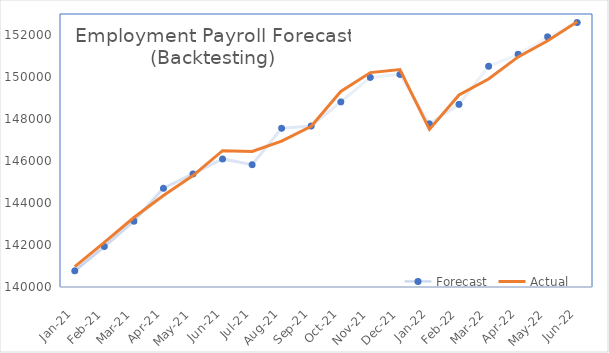
| Category | Forecast | Actual |
|---|---|---|
| 2021-01-01 | 140772.272 | 140974 |
| 2021-02-01 | 141926.707 | 142129 |
| 2021-03-01 | 143132.972 | 143308 |
| 2021-04-01 | 144703.054 | 144358 |
| 2021-05-01 | 145387.76 | 145304 |
| 2021-06-01 | 146098.032 | 146493 |
| 2021-07-01 | 145824.956 | 146452 |
| 2021-08-01 | 147557.402 | 146947 |
| 2021-09-01 | 147664.627 | 147651 |
| 2021-10-01 | 148813.835 | 149310 |
| 2021-11-01 | 149978.929 | 150210 |
| 2021-12-01 | 150121.11 | 150352 |
| 2022-01-01 | 147769.623 | 147505 |
| 2022-02-01 | 148693.216 | 149143 |
| 2022-03-01 | 150511.747 | 149905 |
| 2022-04-01 | 151078.731 | 150957 |
| 2022-05-01 | 151914.101 | 151728 |
| 2022-06-01 | 152592.872 | 152634 |